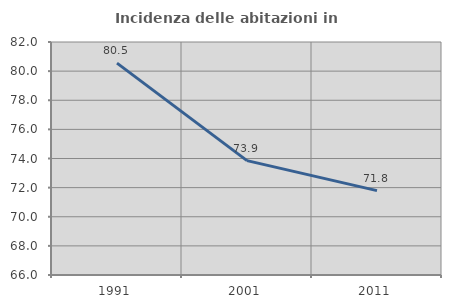
| Category | Incidenza delle abitazioni in proprietà  |
|---|---|
| 1991.0 | 80.548 |
| 2001.0 | 73.856 |
| 2011.0 | 71.795 |